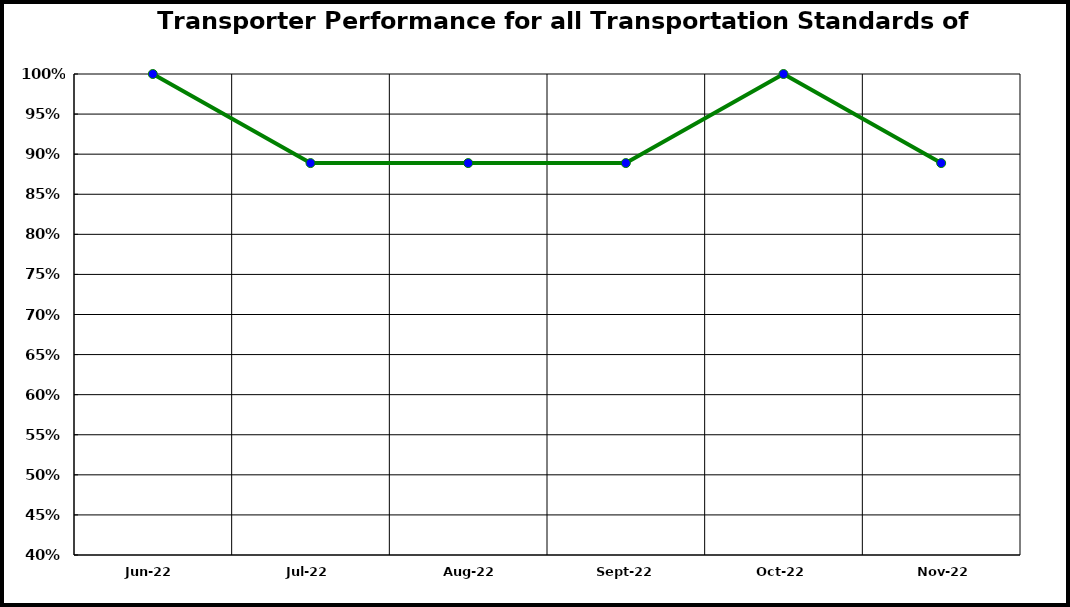
| Category | Performance |
|---|---|
| 2022-06-01 | 1 |
| 2022-07-01 | 0.889 |
| 2022-08-01 | 0.889 |
| 2022-09-01 | 0.889 |
| 2022-10-01 | 1 |
| 2022-11-01 | 0.889 |